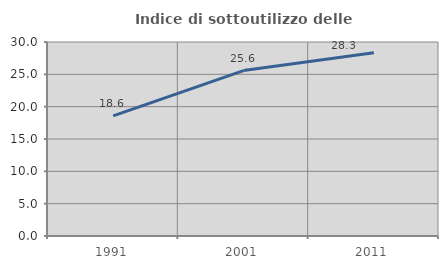
| Category | Indice di sottoutilizzo delle abitazioni  |
|---|---|
| 1991.0 | 18.577 |
| 2001.0 | 25.58 |
| 2011.0 | 28.322 |